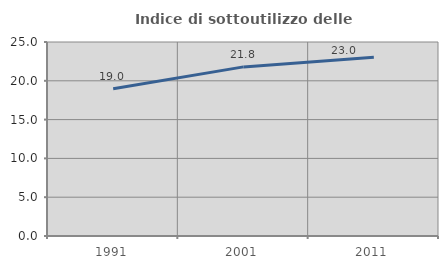
| Category | Indice di sottoutilizzo delle abitazioni  |
|---|---|
| 1991.0 | 18.969 |
| 2001.0 | 21.793 |
| 2011.0 | 23.028 |